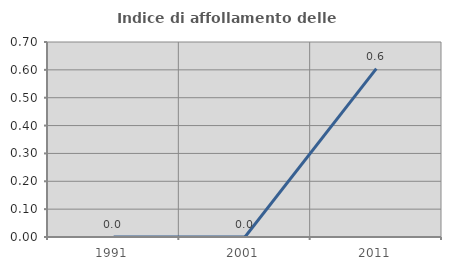
| Category | Indice di affollamento delle abitazioni  |
|---|---|
| 1991.0 | 0 |
| 2001.0 | 0 |
| 2011.0 | 0.604 |